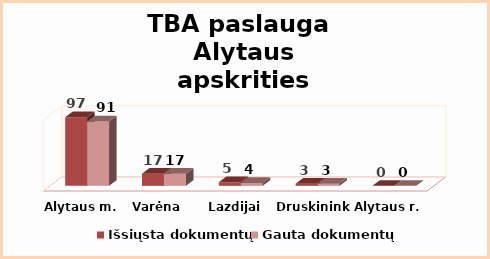
| Category | Išsiųsta dokumentų | Gauta dokumentų |
|---|---|---|
| Alytaus m. | 97 | 91 |
| Varėna | 17 | 17 |
| Lazdijai | 5 | 4 |
| Druskininkai | 3 | 3 |
| Alytaus r. | 0 | 0 |